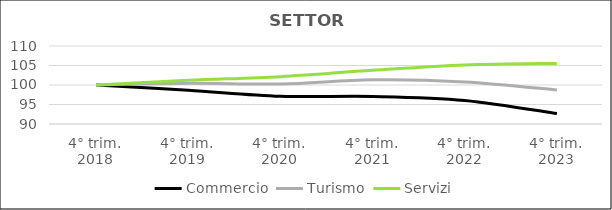
| Category | Commercio | Turismo | Servizi |
|---|---|---|---|
| 4° trim.
2018 | 100 | 100 | 100 |
| 4° trim.
2019 | 98.666 | 100.436 | 101.191 |
| 4° trim.
2020 | 97.118 | 100.272 | 102.135 |
| 4° trim.
2021 | 97.071 | 101.334 | 103.756 |
| 4° trim.
2022 | 96.05 | 100.79 | 105.12 |
| 4° trim.
2023 | 92.665 | 98.72 | 105.539 |